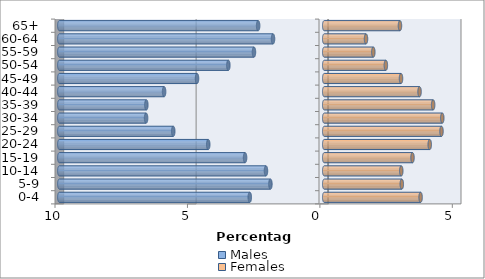
| Category | Males | Females |
|---|---|---|
| 0-4 | -2.81 | 3.639 |
| 5-9 | -2.031 | 2.929 |
| 10-14 | -2.199 | 2.909 |
| 15-19 | -2.988 | 3.333 |
| 20-24 | -4.378 | 3.984 |
| 25-29 | -5.7 | 4.428 |
| 30-34 | -6.725 | 4.457 |
| 35-39 | -6.715 | 4.112 |
| 40-44 | -6.045 | 3.599 |
| 45-49 | -4.802 | 2.899 |
| 50-54 | -3.619 | 2.327 |
| 55-59 | -2.653 | 1.854 |
| 60-64 | -1.933 | 1.578 |
| 65+ | -2.495 | 2.86 |